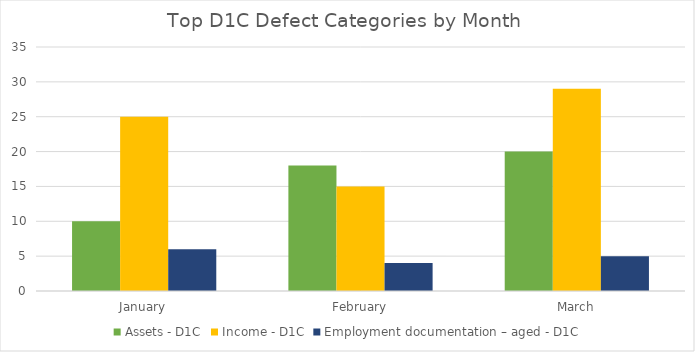
| Category | Assets - D1C | Income - D1C | Employment documentation – aged - D1C |
|---|---|---|---|
| January | 10 | 25 | 6 |
| February | 18 | 15 | 4 |
| March | 20 | 29 | 5 |